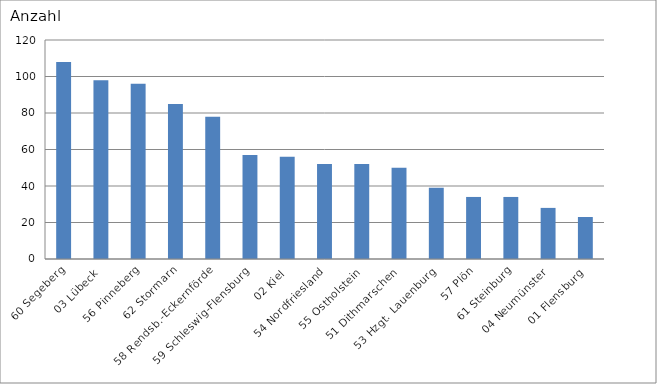
| Category | 60 Segeberg 03 Lübeck 56 Pinneberg 62 Stormarn 58 Rendsb.-Eckernförde 59 Schleswig-Flensburg 02 Kiel 54 Nordfriesland 55 Ostholstein 51 Dithmarschen 53 Hzgt. Lauenburg 57 Plön 61 Steinburg 04 Neumünster 01 Flensburg |
|---|---|
| 60 Segeberg | 108 |
| 03 Lübeck | 98 |
| 56 Pinneberg | 96 |
| 62 Stormarn | 85 |
| 58 Rendsb.-Eckernförde | 78 |
| 59 Schleswig-Flensburg | 57 |
| 02 Kiel | 56 |
| 54 Nordfriesland | 52 |
| 55 Ostholstein | 52 |
| 51 Dithmarschen | 50 |
| 53 Hzgt. Lauenburg | 39 |
| 57 Plön | 34 |
| 61 Steinburg | 34 |
| 04 Neumünster | 28 |
| 01 Flensburg | 23 |